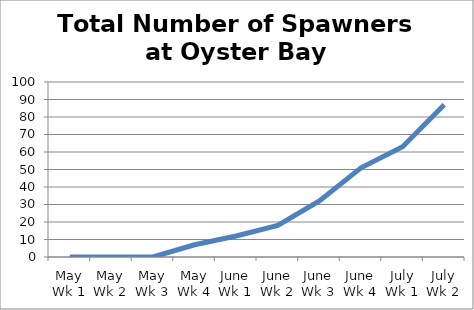
| Category | Number of Spawners |
|---|---|
| May Wk 1 | 0 |
| May Wk 2 | 0 |
| May Wk 3 | 0 |
| May Wk 4 | 7 |
| June Wk 1 | 12 |
| June Wk 2 | 18 |
| June Wk 3 | 32 |
| June Wk 4 | 51 |
| July Wk 1 | 63 |
| July Wk 2 | 87 |